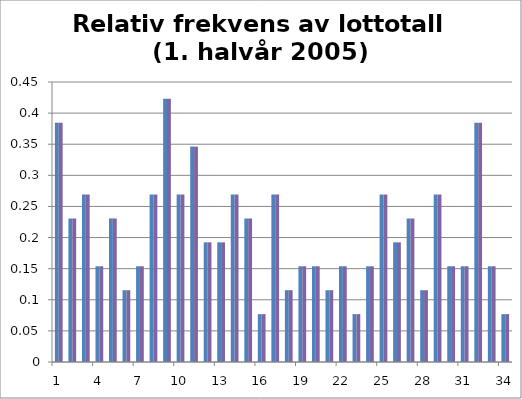
| Category | Relativ frekvens lottotall |
|---|---|
| 1.0 | 0.385 |
| 2.0 | 0.231 |
| 3.0 | 0.269 |
| 4.0 | 0.154 |
| 5.0 | 0.231 |
| 6.0 | 0.115 |
| 7.0 | 0.154 |
| 8.0 | 0.269 |
| 9.0 | 0.423 |
| 10.0 | 0.269 |
| 11.0 | 0.346 |
| 12.0 | 0.192 |
| 13.0 | 0.192 |
| 14.0 | 0.269 |
| 15.0 | 0.231 |
| 16.0 | 0.077 |
| 17.0 | 0.269 |
| 18.0 | 0.115 |
| 19.0 | 0.154 |
| 20.0 | 0.154 |
| 21.0 | 0.115 |
| 22.0 | 0.154 |
| 23.0 | 0.077 |
| 24.0 | 0.154 |
| 25.0 | 0.269 |
| 26.0 | 0.192 |
| 27.0 | 0.231 |
| 28.0 | 0.115 |
| 29.0 | 0.269 |
| 30.0 | 0.154 |
| 31.0 | 0.154 |
| 32.0 | 0.385 |
| 33.0 | 0.154 |
| 34.0 | 0.077 |